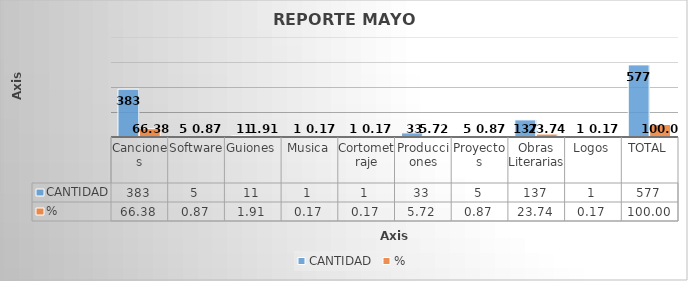
| Category | CANTIDAD | % |
|---|---|---|
| Canciones | 383 | 66.378 |
| Software | 5 | 0.867 |
| Guiones | 11 | 1.906 |
| Musica | 1 | 0.173 |
| Cortometraje | 1 | 0.173 |
| Producciones | 33 | 5.719 |
| Proyectos | 5 | 0.867 |
| Obras Literarias | 137 | 23.744 |
| Logos | 1 | 0.173 |
| TOTAL | 577 | 100 |